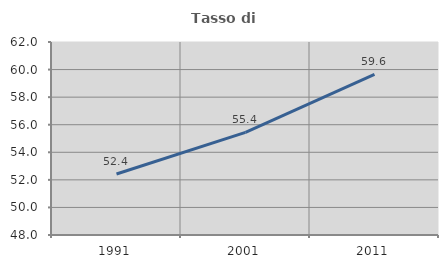
| Category | Tasso di occupazione   |
|---|---|
| 1991.0 | 52.423 |
| 2001.0 | 55.443 |
| 2011.0 | 59.646 |